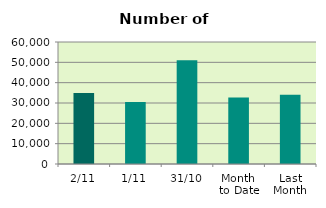
| Category | Series 0 |
|---|---|
| 2/11 | 34960 |
| 1/11 | 30490 |
| 31/10 | 51064 |
| Month 
to Date | 32725 |
| Last
Month | 34034.348 |